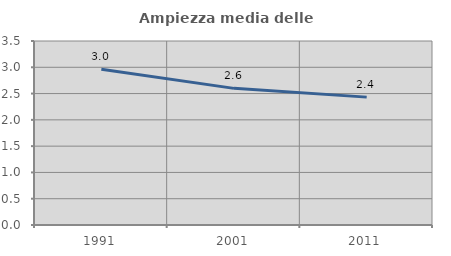
| Category | Ampiezza media delle famiglie |
|---|---|
| 1991.0 | 2.961 |
| 2001.0 | 2.599 |
| 2011.0 | 2.432 |